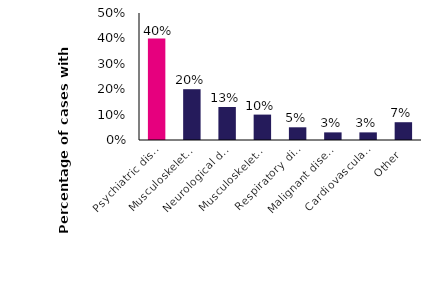
| Category | Series 0 |
|---|---|
| Psychiatric disorders | 0.4 |
| Musculoskeletal disease (general) | 0.2 |
| Neurological disease | 0.13 |
| Musculoskeletal disease (regional) | 0.1 |
| Respiratory disease | 0.05 |
| Malignant disease | 0.03 |
| Cardiovascular disease | 0.03 |
| Other | 0.07 |